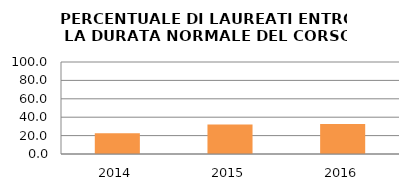
| Category | 2014 2015 2016 |
|---|---|
| 2014.0 | 22.581 |
| 2015.0 | 32 |
| 2016.0 | 32.558 |